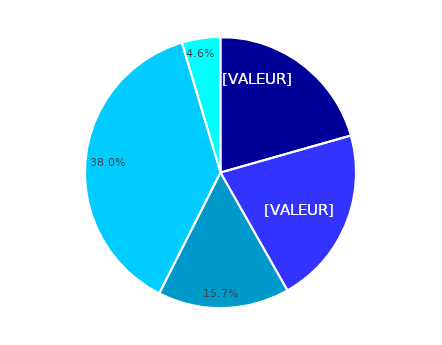
| Category | Situation familiale de l'ensemble des allocataires  |
|---|---|
| Femme isolée | 0.206 |
| Homme isolé | 0.212 |
| Monoparent  | 0.157 |
| Couple avec enfant(s) | 0.38 |
| Couple sans enfant | 0.046 |